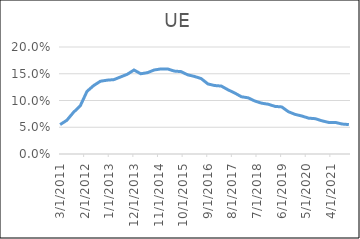
| Category | UE |
|---|---|
| 3/31/11 | 0.055 |
| 6/30/11 | 0.063 |
| 9/30/11 | 0.078 |
| 12/31/11 | 0.09 |
| 3/31/12 | 0.117 |
| 6/30/12 | 0.128 |
| 9/30/12 | 0.136 |
| 12/31/12 | 0.138 |
| 3/31/13 | 0.139 |
| 6/30/13 | 0.144 |
| 9/30/13 | 0.149 |
| 12/31/13 | 0.157 |
| 3/31/14 | 0.15 |
| 6/30/14 | 0.152 |
| 9/30/14 | 0.157 |
| 12/31/14 | 0.159 |
| 3/31/15 | 0.159 |
| 6/30/15 | 0.155 |
| 9/30/15 | 0.154 |
| 12/31/15 | 0.148 |
| 3/31/16 | 0.145 |
| 6/30/16 | 0.141 |
| 9/30/16 | 0.131 |
| 12/31/16 | 0.128 |
| 3/31/17 | 0.127 |
| 6/30/17 | 0.12 |
| 9/30/17 | 0.114 |
| 12/31/17 | 0.107 |
| 3/31/18 | 0.105 |
| 6/30/18 | 0.099 |
| 9/30/18 | 0.095 |
| 12/31/18 | 0.093 |
| 3/31/19 | 0.089 |
| 6/30/19 | 0.088 |
| 9/30/19 | 0.079 |
| 12/31/19 | 0.074 |
| 3/31/20 | 0.071 |
| 6/30/20 | 0.067 |
| 9/30/20 | 0.066 |
| 12/31/20 | 0.062 |
| 3/31/21 | 0.059 |
| 6/30/21 | 0.059 |
| 9/30/21 | 0.056 |
| 12/31/21 | 0.055 |